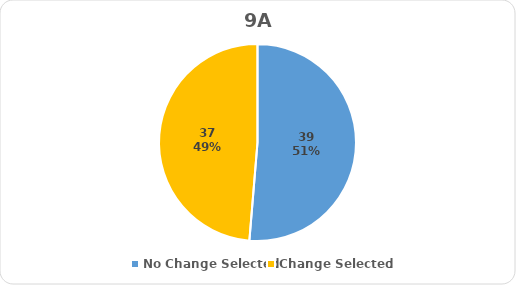
| Category | Series 0 |
|---|---|
| No Change Selected | 39 |
| Change Selected | 37 |